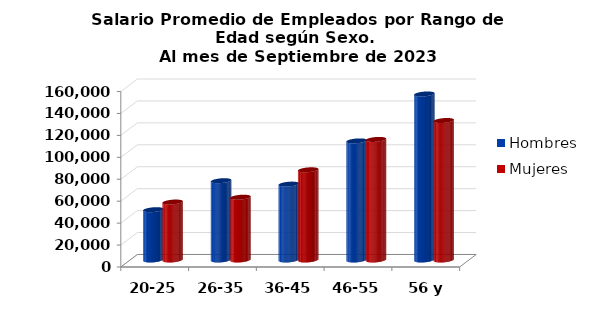
| Category | Hombres | Mujeres |
|---|---|---|
| 20-25 | 45881.818 | 52842.895 |
| 26-35 | 72299.867 | 57261.085 |
| 36-45 | 69186.947 | 82240.278 |
| 46-55 | 108610.556 | 109943.348 |
| 56 y más | 151386.385 | 127198.047 |